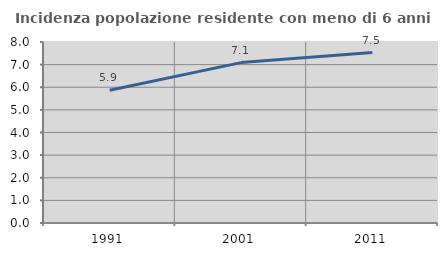
| Category | Incidenza popolazione residente con meno di 6 anni |
|---|---|
| 1991.0 | 5.867 |
| 2001.0 | 7.09 |
| 2011.0 | 7.531 |